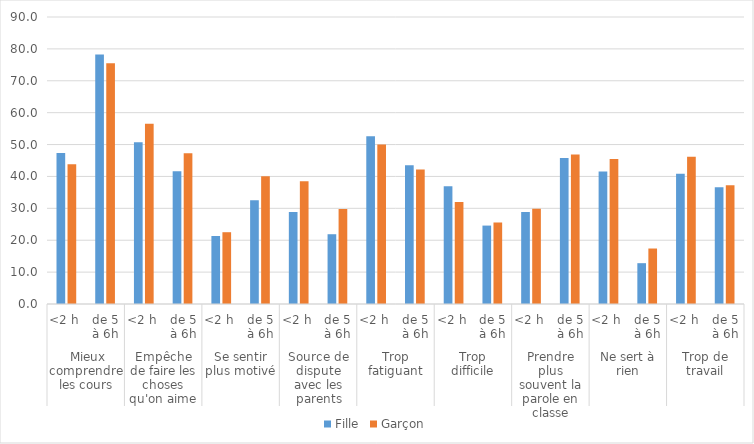
| Category | Fille | Garçon |
|---|---|---|
| 0 | 47.38 | 43.83 |
| 1 | 78.26 | 75.46 |
| 2 | 50.7 | 56.49 |
| 3 | 41.63 | 47.26 |
| 4 | 21.32 | 22.51 |
| 5 | 32.52 | 40.04 |
| 6 | 28.83 | 38.51 |
| 7 | 21.88 | 29.78 |
| 8 | 52.57 | 50.04 |
| 9 | 43.53 | 42.15 |
| 10 | 36.9 | 31.97 |
| 11 | 24.59 | 25.56 |
| 12 | 28.88 | 29.85 |
| 13 | 45.76 | 46.92 |
| 14 | 41.55 | 45.47 |
| 15 | 12.8 | 17.4 |
| 16 | 40.85 | 46.17 |
| 17 | 36.62 | 37.27 |